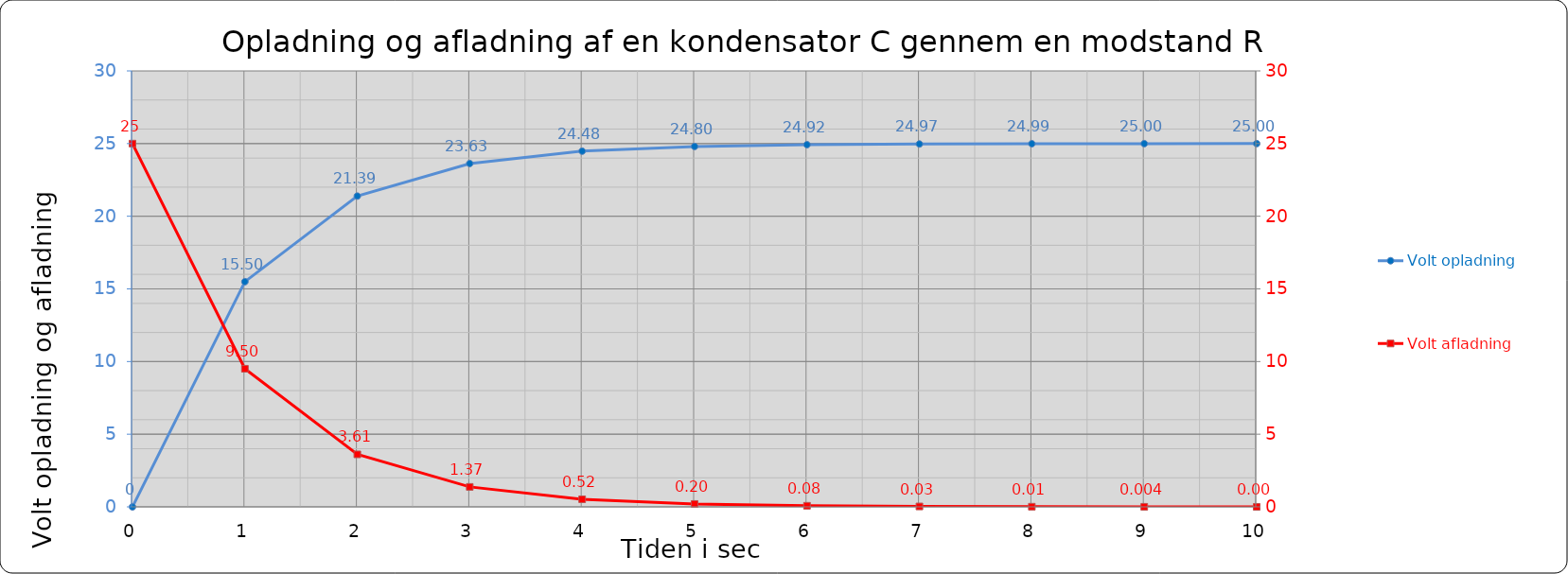
| Category | Volt opladning |
|---|---|
| 0.0 | 0 |
| 1.0 | 15.496 |
| 2.0 | 21.387 |
| 3.0 | 23.626 |
| 4.0 | 24.478 |
| 5.0 | 24.801 |
| 6.0 | 24.925 |
| 7.0 | 24.971 |
| 8.0 | 24.989 |
| 9.0 | 24.996 |
| 10.0 | 24.998 |